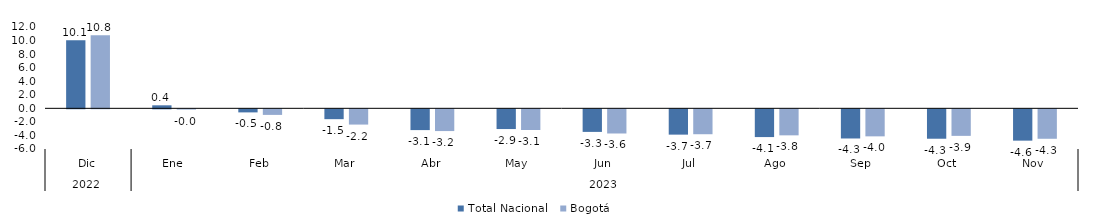
| Category | Total Nacional | Bogotá |
|---|---|---|
| 0 | 10.059 | 10.766 |
| 1 | 0.446 | -0.036 |
| 2 | -0.452 | -0.821 |
| 3 | -1.453 | -2.248 |
| 4 | -3.063 | -3.206 |
| 5 | -2.909 | -3.05 |
| 6 | -3.329 | -3.565 |
| 7 | -3.733 | -3.673 |
| 8 | -4.094 | -3.838 |
| 9 | -4.301 | -3.986 |
| 10 | -4.337 | -3.913 |
| 11 | -4.619 | -4.342 |